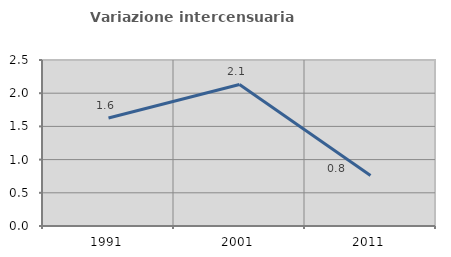
| Category | Variazione intercensuaria annua |
|---|---|
| 1991.0 | 1.628 |
| 2001.0 | 2.132 |
| 2011.0 | 0.762 |